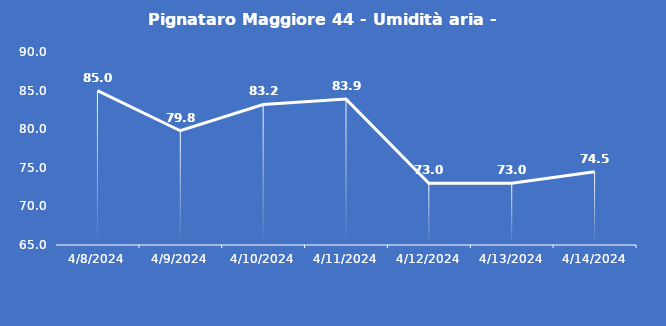
| Category | Pignataro Maggiore 44 - Umidità aria - Grezzo (%) |
|---|---|
| 4/8/24 | 85 |
| 4/9/24 | 79.8 |
| 4/10/24 | 83.2 |
| 4/11/24 | 83.9 |
| 4/12/24 | 73 |
| 4/13/24 | 73 |
| 4/14/24 | 74.5 |